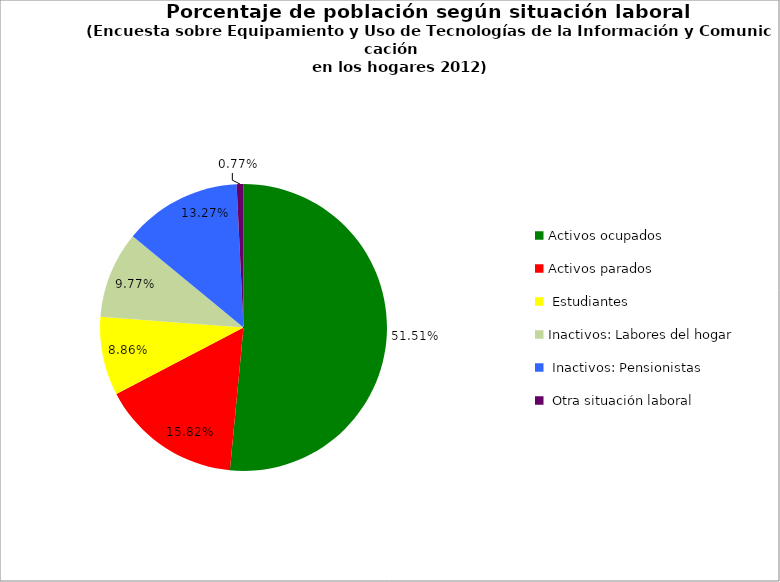
| Category | "Porcentaje de población según situación laboral" |
|---|---|
| Activos ocupados | 0.515 |
| Activos parados | 0.158 |
|  Estudiantes | 0.089 |
| Inactivos: Labores del hogar | 0.098 |
|  Inactivos: Pensionistas | 0.133 |
|  Otra situación laboral | 0.008 |